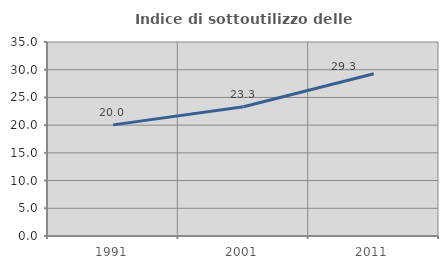
| Category | Indice di sottoutilizzo delle abitazioni  |
|---|---|
| 1991.0 | 20.048 |
| 2001.0 | 23.314 |
| 2011.0 | 29.281 |